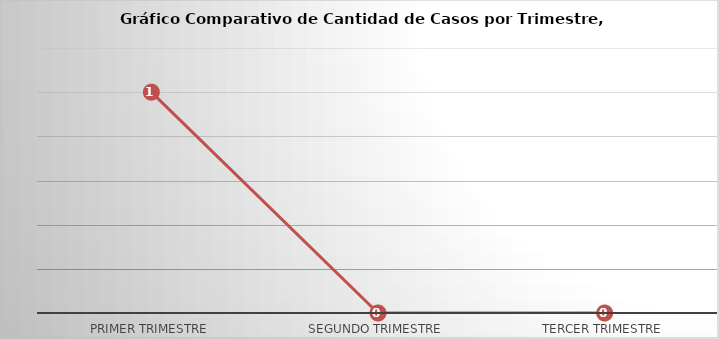
| Category | Series 0 |
|---|---|
| Primer Trimestre | 1 |
| Segundo Trimestre | 0 |
| Tercer Trimestre | 0 |